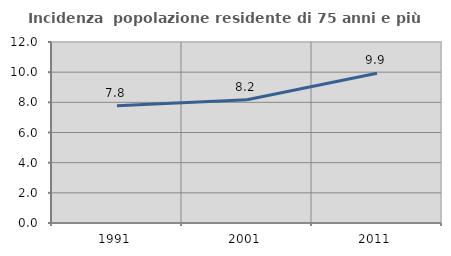
| Category | Incidenza  popolazione residente di 75 anni e più |
|---|---|
| 1991.0 | 7.768 |
| 2001.0 | 8.176 |
| 2011.0 | 9.931 |